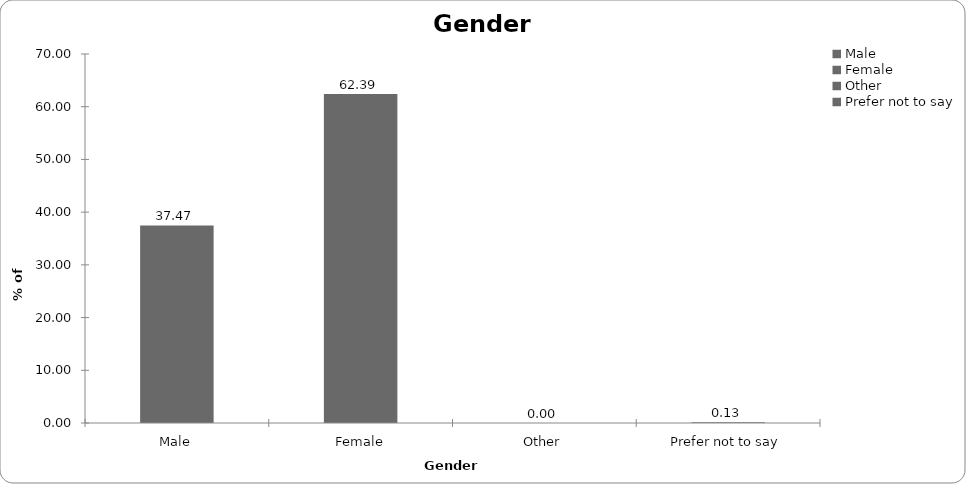
| Category | Series 0 |
|---|---|
| Male | 37.475 |
| Female | 62.391 |
| Other | 0 |
| Prefer not to say | 0.134 |